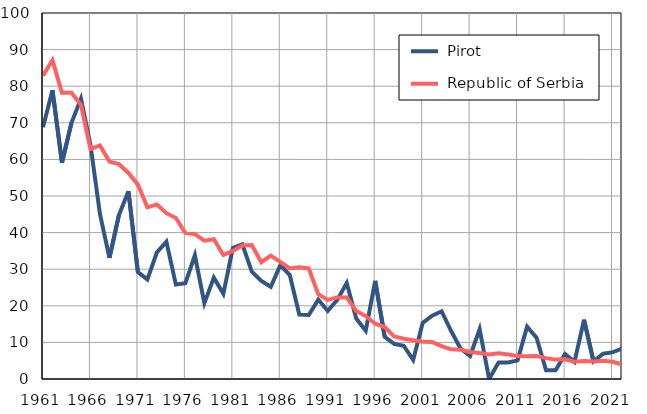
| Category |  Pirot |  Republic of Serbia |
|---|---|---|
| 1961.0 | 68.8 | 82.9 |
| 1962.0 | 78.9 | 87.1 |
| 1963.0 | 59.1 | 78.2 |
| 1964.0 | 70 | 78.2 |
| 1965.0 | 76.6 | 74.9 |
| 1966.0 | 64 | 62.8 |
| 1967.0 | 45.1 | 63.8 |
| 1968.0 | 33.1 | 59.4 |
| 1969.0 | 44.8 | 58.7 |
| 1970.0 | 51.3 | 56.3 |
| 1971.0 | 29.2 | 53.1 |
| 1972.0 | 27.2 | 46.9 |
| 1973.0 | 34.6 | 47.7 |
| 1974.0 | 37.5 | 45.3 |
| 1975.0 | 25.8 | 44 |
| 1976.0 | 26.2 | 39.9 |
| 1977.0 | 33.8 | 39.6 |
| 1978.0 | 20.7 | 37.8 |
| 1979.0 | 27.7 | 38.2 |
| 1980.0 | 23.3 | 33.9 |
| 1981.0 | 35.8 | 35 |
| 1982.0 | 36.8 | 36.5 |
| 1983.0 | 29.3 | 36.6 |
| 1984.0 | 26.8 | 31.9 |
| 1985.0 | 25.2 | 33.7 |
| 1986.0 | 31.1 | 32 |
| 1987.0 | 28.4 | 30.2 |
| 1988.0 | 17.6 | 30.5 |
| 1989.0 | 17.5 | 30.2 |
| 1990.0 | 21.7 | 23.2 |
| 1991.0 | 18.6 | 21.6 |
| 1992.0 | 21.6 | 22.3 |
| 1993.0 | 26.2 | 22.3 |
| 1994.0 | 16.5 | 18.6 |
| 1995.0 | 13.2 | 17.2 |
| 1996.0 | 26.8 | 15.1 |
| 1997.0 | 11.5 | 14.2 |
| 1998.0 | 9.6 | 11.6 |
| 1999.0 | 9.1 | 11 |
| 2000.0 | 5.2 | 10.6 |
| 2001.0 | 15.3 | 10.2 |
| 2002.0 | 17.3 | 10.1 |
| 2003.0 | 18.5 | 9 |
| 2004.0 | 13.1 | 8.1 |
| 2005.0 | 8.3 | 8 |
| 2006.0 | 6.3 | 7.4 |
| 2007.0 | 13.6 | 7.1 |
| 2008.0 | 0 | 6.7 |
| 2009.0 | 4.5 | 7 |
| 2010.0 | 4.5 | 6.7 |
| 2011.0 | 5.1 | 6.3 |
| 2012.0 | 14.3 | 6.2 |
| 2013.0 | 11.3 | 6.3 |
| 2014.0 | 2.4 | 5.7 |
| 2015.0 | 2.4 | 5.3 |
| 2016.0 | 6.8 | 5.4 |
| 2017.0 | 4.7 | 4.7 |
| 2018.0 | 16.2 | 4.9 |
| 2019.0 | 4.8 | 4.8 |
| 2020.0 | 6.9 | 5 |
| 2021.0 | 7.3 | 4.7 |
| 2022.0 | 8.3 | 4 |